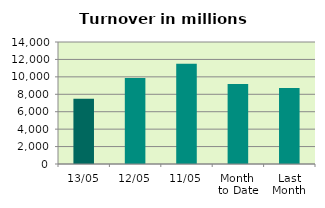
| Category | Series 0 |
|---|---|
| 13/05 | 7494.062 |
| 12/05 | 9857.685 |
| 11/05 | 11497.541 |
| Month 
to Date | 9183.618 |
| Last
Month | 8713.977 |